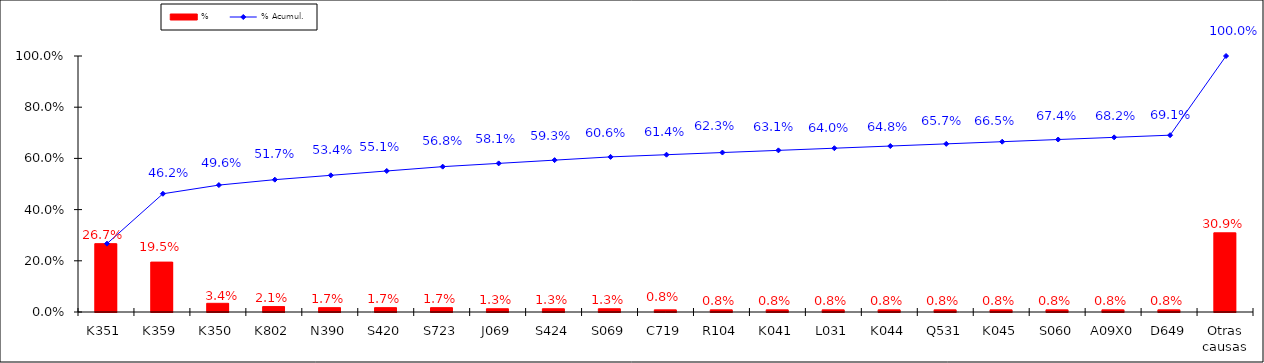
| Category | % |
|---|---|
| K351 | 0.267 |
| K359 | 0.195 |
| K350 | 0.034 |
| K802 | 0.021 |
| N390 | 0.017 |
| S420 | 0.017 |
| S723 | 0.017 |
| J069 | 0.013 |
| S424 | 0.013 |
| S069 | 0.013 |
| C719 | 0.008 |
| R104 | 0.008 |
| K041 | 0.008 |
| L031 | 0.008 |
| K044 | 0.008 |
| Q531 | 0.008 |
| K045 | 0.008 |
| S060 | 0.008 |
| A09X0 | 0.008 |
| D649 | 0.008 |
| Otras causas | 0.309 |